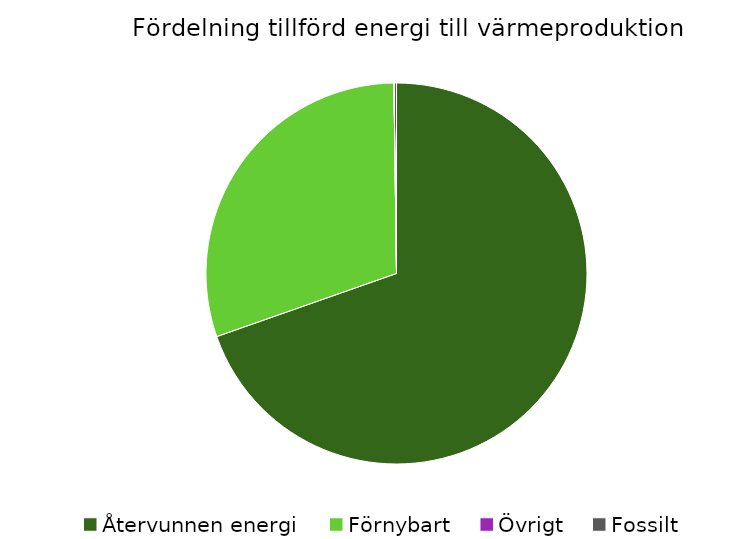
| Category | Fördelning värmeproduktion |
|---|---|
| Återvunnen energi | 0.696 |
| Förnybart | 0.302 |
| Övrigt | 0 |
| Fossilt | 0.002 |